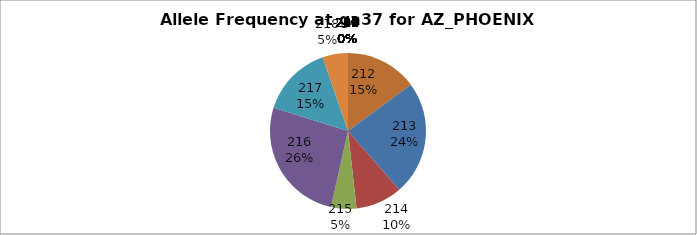
| Category | Series 0 |
|---|---|
| 207.0 | 0 |
| 208.0 | 0 |
| 209.0 | 0 |
| 210.0 | 0 |
| 211.0 | 0 |
| 212.0 | 0.149 |
| 213.0 | 0.237 |
| 214.0 | 0.096 |
| 215.0 | 0.053 |
| 216.0 | 0.263 |
| 217.0 | 0.149 |
| 218.0 | 0.053 |
| 226.0 | 0 |
| 227.0 | 0 |
| 228.0 | 0 |
| 229.0 | 0 |
| 230.0 | 0 |
| 231.0 | 0 |
| 232.0 | 0 |
| 234.0 | 0 |
| 239.0 | 0 |
| 240.0 | 0 |
| 247.0 | 0 |
| 248.0 | 0 |
| 249.0 | 0 |
| 250.0 | 0 |